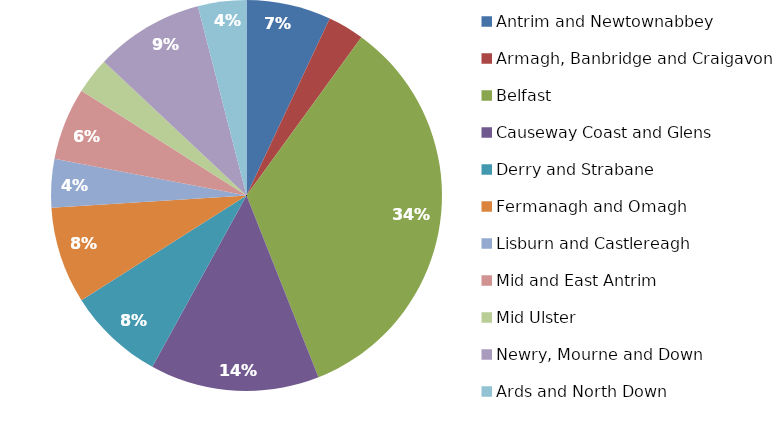
| Category | Series 0 |
|---|---|
| Antrim and Newtownabbey | 7 |
| Armagh, Banbridge and Craigavon | 3 |
| Belfast | 34 |
| Causeway Coast and Glens | 14 |
| Derry and Strabane | 8 |
| Fermanagh and Omagh | 8 |
| Lisburn and Castlereagh | 4 |
| Mid and East Antrim | 6 |
| Mid Ulster | 3 |
| Newry, Mourne and Down | 9 |
| Ards and North Down | 4 |